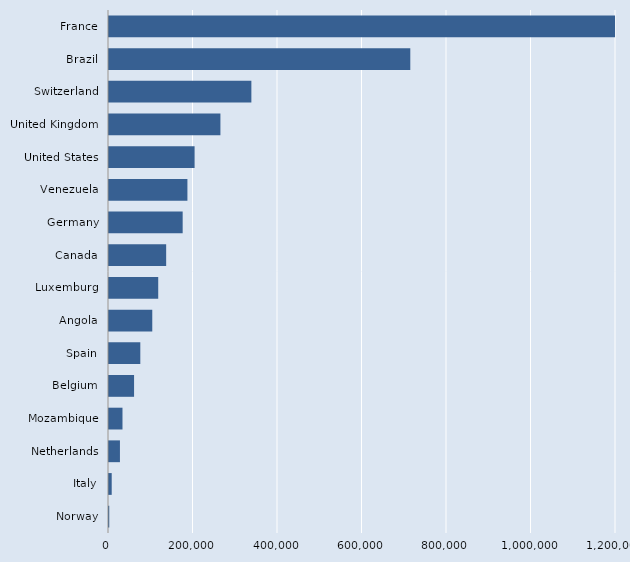
| Category | Series 0 |
|---|---|
| Norway | 609 |
| Italy | 6411 |
| Netherlands | 25893 |
| Mozambique | 31926 |
| Belgium | 59336 |
| Spain | 74112 |
| Angola | 102420 |
| Luxemburg | 116505 |
| Canada | 135301 |
| Germany | 174363 |
| Venezuela | 185600 |
| United States | 202583 |
| United Kingdom | 263706 |
| Switzerland | 336975 |
| Brazil | 713130 |
| France | 1205308 |